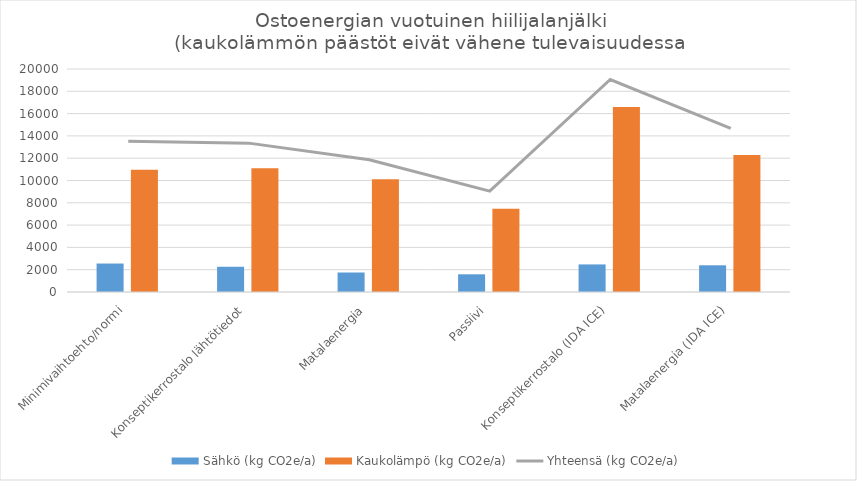
| Category | Sähkö (kg CO2e/a) | Kaukolämpö (kg CO2e/a) |
|---|---|---|
| Minimivaihtoehto/normi | 2553.024 | 10958.4 |
| Konseptikerrostalo lähtötiedot | 2263.44 | 11087.55 |
| Matalaenergia | 1748.832 | 10111.8 |
| Passiivi | 1586.496 | 7460.55 |
| Konseptikerrostalo (IDA ICE) | 2473.536 | 16583.7 |
| Matalaenergia (IDA ICE) | 2394.816 | 12284.4 |